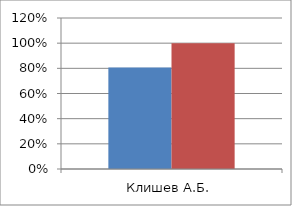
| Category | Series 0 | 2 |
|---|---|---|
| Клишев А.Б. | 0.806 | 1 |